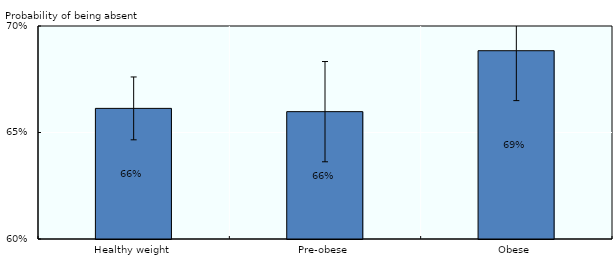
| Category | Series 0 |
|---|---|
| Healthy weight | 0.661 |
| Pre-obese | 0.66 |
| Obese | 0.688 |